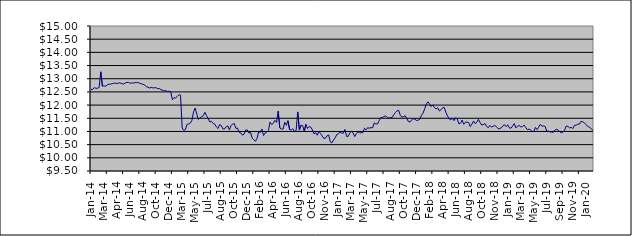
| Category | Series 0 |
|---|---|
| 2014-01-09 | 12.597 |
| 2014-01-17 | 12.594 |
| 2014-01-23 | 12.663 |
| 2014-01-31 | 12.636 |
| 2014-02-10 | 12.638 |
| 2014-02-14 | 12.669 |
| 2014-02-20 | 13.262 |
| 2014-02-28 | 12.718 |
| 2014-03-10 | 12.733 |
| 2014-03-14 | 12.714 |
| 2014-03-20 | 12.765 |
| 2014-03-26 | 12.796 |
| 2014-03-31 | 12.791 |
| 2014-04-09 | 12.812 |
| 2014-04-15 | 12.832 |
| 2014-04-24 | 12.831 |
| 2014-04-30 | 12.815 |
| 2014-05-08 | 12.848 |
| 2014-05-16 | 12.832 |
| 2014-05-22 | 12.819 |
| 2014-05-31 | 12.795 |
| 2014-06-09 | 12.842 |
| 2014-06-16 | 12.859 |
| 2014-06-20 | 12.862 |
| 2014-06-30 | 12.827 |
| 2014-07-09 | 12.842 |
| 2014-07-15 | 12.837 |
| 2014-07-22 | 12.849 |
| 2014-07-31 | 12.851 |
| 2014-08-11 | 12.857 |
| 2014-08-14 | 12.822 |
| 2014-08-21 | 12.809 |
| 2014-08-30 | 12.789 |
| 2014-09-08 | 12.763 |
| 2014-09-16 | 12.695 |
| 2014-09-23 | 12.68 |
| 2014-09-30 | 12.645 |
| 2014-10-09 | 12.675 |
| 2014-10-16 | 12.65 |
| 2014-10-23 | 12.659 |
| 2014-10-31 | 12.659 |
| 2014-11-10 | 12.622 |
| 2014-11-13 | 12.627 |
| 2014-11-20 | 12.58 |
| 2014-11-29 | 12.566 |
| 2014-12-10 | 12.535 |
| 2014-12-18 | 12.55 |
| 2014-12-23 | 12.516 |
| 2014-12-30 | 12.526 |
| 2015-01-08 | 12.5 |
| 2015-01-15 | 12.205 |
| 2015-01-30 | 12.283 |
| 2015-02-10 | 12.271 |
| 2015-02-16 | 12.328 |
| 2015-02-19 | 12.392 |
| 2015-02-28 | 12.379 |
| 2015-03-10 | 11.136 |
| 2015-03-13 | 11.042 |
| 2015-03-19 | 11.073 |
| 2015-03-27 | 11.27 |
| 2015-04-07 | 11.28 |
| 2015-04-16 | 11.318 |
| 2015-04-27 | 11.422 |
| 2015-05-08 | 11.742 |
| 2015-05-14 | 11.891 |
| 2015-05-21 | 11.647 |
| 2015-05-27 | 11.457 |
| 2015-06-03 | 11.511 |
| 2015-06-09 | 11.563 |
| 2015-06-15 | 11.599 |
| 2015-06-22 | 11.726 |
| 2015-06-26 | 11.596 |
| 2015-07-02 | 11.484 |
| 2015-07-09 | 11.356 |
| 2015-07-14 | 11.386 |
| 2015-07-23 | 11.307 |
| 2015-07-29 | 11.281 |
| 2015-08-06 | 11.173 |
| 2015-08-13 | 11.113 |
| 2015-08-20 | 11.257 |
| 2015-08-27 | 11.228 |
| 2015-09-03 | 11.099 |
| 2015-09-09 | 11.094 |
| 2015-09-15 | 11.179 |
| 2015-09-21 | 11.212 |
| 2015-09-28 | 11.06 |
| 2015-10-07 | 11.218 |
| 2015-10-13 | 11.282 |
| 2015-10-22 | 11.301 |
| 2015-10-28 | 11.117 |
| 2015-11-04 | 11.126 |
| 2015-11-13 | 10.969 |
| 2015-11-19 | 10.946 |
| 2015-11-27 | 10.859 |
| 2015-12-03 | 10.896 |
| 2015-12-10 | 11.056 |
| 2015-12-15 | 11.058 |
| 2015-12-23 | 10.939 |
| 2015-12-29 | 10.97 |
| 2016-01-07 | 10.749 |
| 2016-01-14 | 10.691 |
| 2016-01-21 | 10.628 |
| 2016-01-28 | 10.74 |
| 2016-02-04 | 10.991 |
| 2016-02-11 | 10.963 |
| 2016-02-18 | 11.093 |
| 2016-02-25 | 10.847 |
| 2016-03-03 | 10.944 |
| 2016-03-10 | 10.974 |
| 2016-03-16 | 11.037 |
| 2016-03-29 | 11.357 |
| 2016-04-07 | 11.261 |
| 2016-04-14 | 11.311 |
| 2016-04-28 | 11.419 |
| 2016-05-05 | 11.347 |
| 2016-05-12 | 11.767 |
| 2016-05-19 | 11.13 |
| 2016-05-30 | 11.092 |
| 2016-06-03 | 11.088 |
| 2016-06-09 | 11.347 |
| 2016-06-15 | 11.234 |
| 2016-06-23 | 11.409 |
| 2016-06-29 | 11.064 |
| 2016-07-11 | 11.056 |
| 2016-07-14 | 11.105 |
| 2016-07-21 | 10.994 |
| 2016-07-28 | 11.035 |
| 2016-08-04 | 11.74 |
| 2016-08-11 | 11.052 |
| 2016-08-16 | 11.229 |
| 2016-08-24 | 11.229 |
| 2016-08-30 | 10.998 |
| 2016-09-08 | 11.271 |
| 2016-09-15 | 11.111 |
| 2016-09-22 | 11.186 |
| 2016-09-29 | 11.167 |
| 2016-10-06 | 11.059 |
| 2016-10-13 | 10.904 |
| 2016-10-20 | 10.958 |
| 2016-10-28 | 10.858 |
| 2016-11-03 | 11.012 |
| 2016-11-10 | 10.918 |
| 2016-11-15 | 10.834 |
| 2016-11-23 | 10.734 |
| 2016-11-29 | 10.739 |
| 2016-12-07 | 10.833 |
| 2016-12-14 | 10.865 |
| 2016-12-21 | 10.604 |
| 2016-12-28 | 10.568 |
| 2017-01-05 | 10.675 |
| 2017-01-16 | 10.76 |
| 2017-01-23 | 10.887 |
| 2017-01-30 | 10.908 |
| 2017-02-06 | 10.979 |
| 2017-02-13 | 10.938 |
| 2017-02-20 | 10.934 |
| 2017-02-27 | 11.075 |
| 2017-03-06 | 10.813 |
| 2017-03-13 | 10.815 |
| 2017-03-20 | 10.952 |
| 2017-03-27 | 11.003 |
| 2017-03-30 | 10.949 |
| 2017-04-10 | 10.805 |
| 2017-04-18 | 10.917 |
| 2017-04-24 | 10.985 |
| 2017-04-28 | 10.949 |
| 2017-05-08 | 10.953 |
| 2017-05-15 | 10.952 |
| 2017-05-22 | 11.119 |
| 2017-05-30 | 11.062 |
| 2017-06-06 | 11.146 |
| 2017-06-12 | 11.122 |
| 2017-06-15 | 11.147 |
| 2017-06-20 | 11.138 |
| 2017-06-29 | 11.325 |
| 2017-07-04 | 11.285 |
| 2017-07-10 | 11.285 |
| 2017-07-14 | 11.41 |
| 2017-07-19 | 11.527 |
| 2017-07-24 | 11.529 |
| 2017-07-28 | 11.567 |
| 2017-08-03 | 11.592 |
| 2017-08-09 | 11.528 |
| 2017-08-14 | 11.507 |
| 2017-08-21 | 11.524 |
| 2017-08-24 | 11.532 |
| 2017-08-30 | 11.635 |
| 2017-09-07 | 11.718 |
| 2017-09-14 | 11.779 |
| 2017-09-20 | 11.807 |
| 2017-09-29 | 11.613 |
| 2017-10-05 | 11.542 |
| 2017-10-11 | 11.56 |
| 2017-10-16 | 11.597 |
| 2017-10-23 | 11.494 |
| 2017-10-30 | 11.372 |
| 2017-11-07 | 11.36 |
| 2017-11-15 | 11.441 |
| 2017-11-23 | 11.486 |
| 2017-11-29 | 11.462 |
| 2017-12-07 | 11.416 |
| 2017-12-13 | 11.43 |
| 2017-12-18 | 11.463 |
| 2017-12-28 | 11.615 |
| 2018-01-08 | 11.696 |
| 2018-01-17 | 11.86 |
| 2018-01-24 | 12.045 |
| 2018-01-30 | 12.124 |
| 2018-02-05 | 12.029 |
| 2018-02-13 | 11.942 |
| 2018-02-19 | 12.008 |
| 2018-02-27 | 11.903 |
| 2018-03-07 | 11.857 |
| 2018-03-14 | 11.897 |
| 2018-03-21 | 11.777 |
| 2018-03-29 | 11.823 |
| 2018-04-10 | 11.899 |
| 2018-04-16 | 11.91 |
| 2018-04-23 | 11.725 |
| 2018-04-27 | 11.591 |
| 2018-05-10 | 11.478 |
| 2018-05-15 | 11.436 |
| 2018-05-22 | 11.508 |
| 2018-05-30 | 11.409 |
| 2018-06-06 | 11.519 |
| 2018-06-13 | 11.474 |
| 2018-06-20 | 11.289 |
| 2018-06-29 | 11.311 |
| 2018-07-10 | 11.432 |
| 2018-07-16 | 11.273 |
| 2018-07-23 | 11.354 |
| 2018-07-30 | 11.354 |
| 2018-08-07 | 11.337 |
| 2018-08-13 | 11.185 |
| 2018-08-24 | 11.278 |
| 2018-08-30 | 11.394 |
| 2018-09-06 | 11.299 |
| 2018-09-13 | 11.347 |
| 2018-09-24 | 11.458 |
| 2018-09-28 | 11.342 |
| 2018-10-04 | 11.243 |
| 2018-10-10 | 11.26 |
| 2018-10-16 | 11.301 |
| 2018-10-23 | 11.196 |
| 2018-10-30 | 11.139 |
| 2018-11-07 | 11.229 |
| 2018-11-15 | 11.165 |
| 2018-11-21 | 11.195 |
| 2018-11-29 | 11.226 |
| 2018-12-07 | 11.187 |
| 2018-12-14 | 11.109 |
| 2018-12-21 | 11.106 |
| 2018-12-28 | 11.134 |
| 2019-01-08 | 11.209 |
| 2019-01-14 | 11.257 |
| 2019-01-21 | 11.183 |
| 2019-01-30 | 11.253 |
| 2019-02-11 | 11.136 |
| 2019-02-14 | 11.123 |
| 2019-02-21 | 11.203 |
| 2019-02-27 | 11.298 |
| 2019-03-07 | 11.133 |
| 2019-03-14 | 11.194 |
| 2019-03-21 | 11.227 |
| 2019-03-29 | 11.174 |
| 2019-04-04 | 11.182 |
| 2019-04-12 | 11.242 |
| 2019-04-18 | 11.154 |
| 2019-04-29 | 11.072 |
| 2019-05-08 | 11.087 |
| 2019-05-15 | 11.064 |
| 2019-05-23 | 10.989 |
| 2019-05-30 | 11.002 |
| 2019-06-10 | 11.153 |
| 2019-06-14 | 11.067 |
| 2019-06-21 | 11.162 |
| 2019-06-28 | 11.269 |
| 2019-07-04 | 11.202 |
| 2019-07-15 | 11.21 |
| 2019-07-22 | 11.189 |
| 2019-07-30 | 11.011 |
| 2019-08-06 | 11.009 |
| 2019-08-16 | 10.982 |
| 2019-08-22 | 10.978 |
| 2019-08-30 | 10.966 |
| 2019-09-09 | 11.053 |
| 2019-09-16 | 11.079 |
| 2019-09-20 | 11.055 |
| 2019-09-27 | 10.982 |
| 2019-10-03 | 10.952 |
| 2019-10-09 | 10.977 |
| 2019-10-15 | 11.059 |
| 2019-10-30 | 11.209 |
| 2019-11-07 | 11.191 |
| 2019-11-14 | 11.136 |
| 2019-11-21 | 11.155 |
| 2019-11-29 | 11.109 |
| 2019-12-05 | 11.231 |
| 2019-12-11 | 11.239 |
| 2019-12-17 | 11.277 |
| 2019-12-23 | 11.275 |
| 2019-12-30 | 11.385 |
| 2020-01-07 | 11.364 |
| 2020-01-15 | 11.337 |
| 2020-01-22 | 11.268 |
| 2020-01-30 | 11.196 |
| 2020-02-06 | 11.168 |
| 2020-02-14 | 11.123 |
| 2020-02-20 | 11.053 |
| 2020-02-28 | 11.094 |